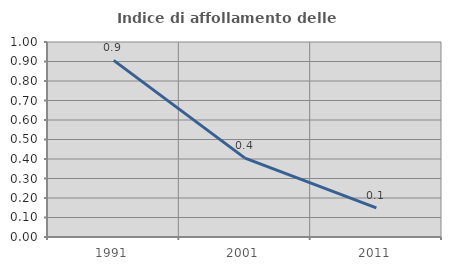
| Category | Indice di affollamento delle abitazioni  |
|---|---|
| 1991.0 | 0.906 |
| 2001.0 | 0.404 |
| 2011.0 | 0.149 |